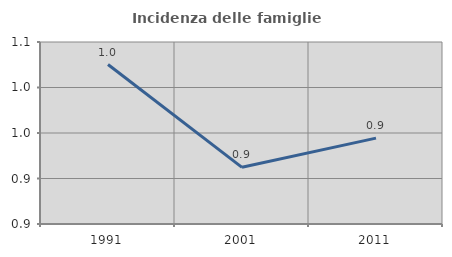
| Category | Incidenza delle famiglie numerose |
|---|---|
| 1991.0 | 1.025 |
| 2001.0 | 0.912 |
| 2011.0 | 0.944 |